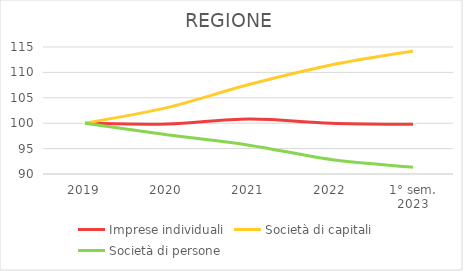
| Category | Imprese individuali | Società di capitali | Società di persone |
|---|---|---|---|
| 2019 | 100 | 100 | 100 |
| 2020 | 99.847 | 103.072 | 97.738 |
| 2021 | 100.828 | 107.625 | 95.674 |
| 2022 | 100.004 | 111.473 | 92.85 |
| 1° sem.
2023 | 99.785 | 114.218 | 91.334 |